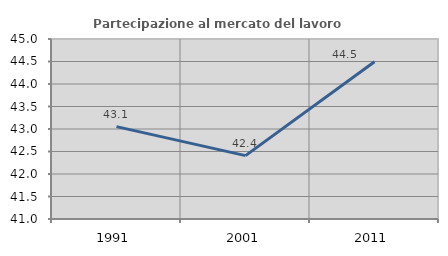
| Category | Partecipazione al mercato del lavoro  femminile |
|---|---|
| 1991.0 | 43.053 |
| 2001.0 | 42.409 |
| 2011.0 | 44.496 |